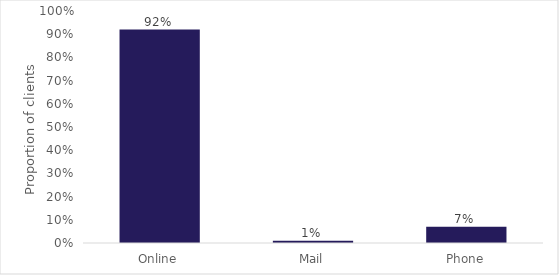
| Category | Series 0 |
|---|---|
| Online | 0.92 |
| Mail | 0.01 |
| Phone | 0.07 |